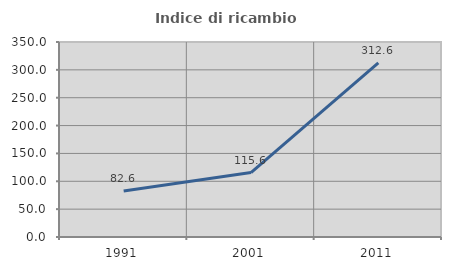
| Category | Indice di ricambio occupazionale  |
|---|---|
| 1991.0 | 82.639 |
| 2001.0 | 115.589 |
| 2011.0 | 312.596 |